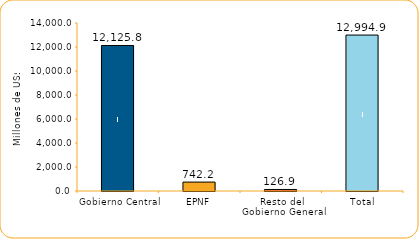
| Category | Series 1 |
|---|---|
| Gobierno Central | 12125.8 |
| EPNF | 742.2 |
| Resto del Gobierno General | 126.9 |
| Total | 12994.9 |